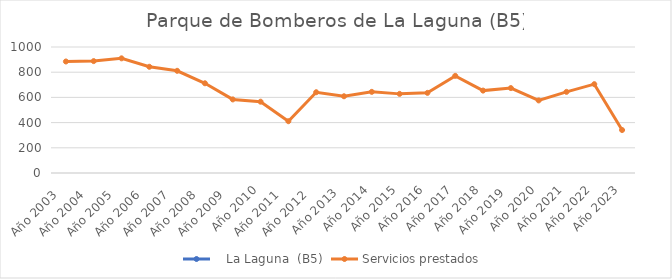
| Category |    La Laguna  (B5) | Servicios prestados  |
|---|---|---|
| Año 2003   |  | 885 |
| Año 2004   |  | 888 |
| Año 2005   |  | 910 |
| Año 2006   |  | 843 |
| Año 2007   |  | 811 |
| Año 2008   |  | 712 |
| Año 2009   |  | 584 |
| Año 2010 |  | 566 |
| Año 2011   |  | 411 |
| Año 2012   |  | 641 |
| Año 2013  |  | 609 |
| Año 2014 |  | 644 |
| Año 2015 |  | 628 |
| Año 2016 |  | 636 |
| Año 2017 |  | 771 |
| Año 2018 |  | 654 |
| Año 2019  |  | 674 |
| Año 2020 |  | 576 |
| Año 2021 |  | 644 |
| Año 2022 |  | 705 |
| Año 2023 |  | 341 |